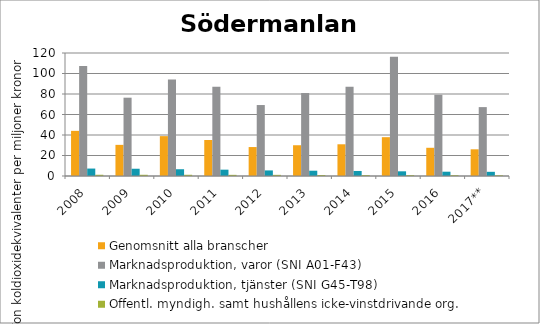
| Category | Genomsnitt alla branscher | Marknadsproduktion, varor (SNI A01-F43) | Marknadsproduktion, tjänster (SNI G45-T98) | Offentl. myndigh. samt hushållens icke-vinstdrivande org. |
|---|---|---|---|---|
| 2008 | 44.04 | 107.214 | 7.258 | 1.201 |
| 2009 | 30.374 | 76.402 | 7.083 | 1.185 |
| 2010 | 38.896 | 94.267 | 6.599 | 1.19 |
| 2011 | 35.13 | 86.956 | 6.175 | 1.119 |
| 2012 | 28.241 | 69.233 | 5.447 | 1.123 |
| 2013 | 30.014 | 80.934 | 5.163 | 0.974 |
| 2014 | 30.944 | 87.048 | 4.909 | 0.885 |
| 2015 | 37.871 | 116.462 | 4.574 | 0.852 |
| 2016 | 27.53 | 79.272 | 4.198 | 0.794 |
| 2017** | 26.046 | 67.206 | 4.087 | 0.705 |